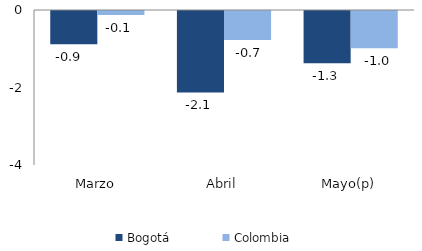
| Category | Bogotá | Colombia |
|---|---|---|
| Marzo | -0.859 | -0.103 |
| Abril | -2.101 | -0.746 |
| Mayo(p) | -1.349 | -0.963 |